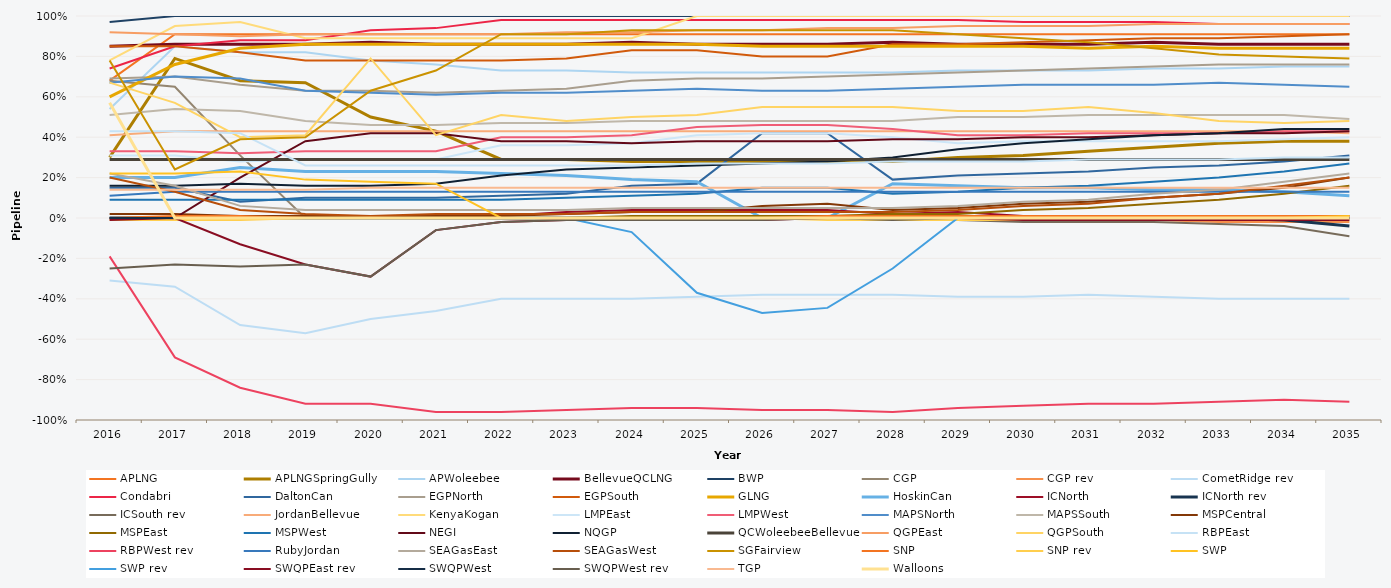
| Category | APLNG | APLNGSpringGully | APWoleebee | BellevueQCLNG | BWP | CGP | CGP rev | CometRidge rev | Condabri | DaltonCan | EGPNorth | EGPSouth | GLNG | HoskinCan | ICNorth | ICNorth rev | ICSouth rev | JordanBellevue | KenyaKogan | LMPEast | LMPWest | MAPSNorth | MAPSSouth | MSPCentral | MSPEast | MSPWest | NEGI | NQGP | QCWoleebeeBellevue | QGPEast | QGPSouth | RBPEast | RBPWest rev | RubyJordan | SEAGasEast | SEAGasWest | SGFairview | SNP | SNP rev | SWP | SWP rev | SWQPEast rev | SWQPWest | SWQPWest rev | TGP | Walloons |
|---|---|---|---|---|---|---|---|---|---|---|---|---|---|---|---|---|---|---|---|---|---|---|---|---|---|---|---|---|---|---|---|---|---|---|---|---|---|---|---|---|---|---|---|---|---|---|
| 2016.0 | 0.68 | 0.3 | 0.54 | 0.85 | 0.97 | 0.68 | 0 | -0.31 | 0.74 | 0.15 | 0.69 | 0.85 | 0.6 | 0.2 | 0 | 0 | 0 | 0.41 | 0.78 | 0.31 | 0.33 | 0.67 | 0.51 | 0.02 | 0 | 0.09 | 0 | 0.16 | 0.29 | 0.92 | 0.67 | 0.43 | -0.19 | 0.11 | 0.22 | 0.2 | 0.78 | 0 | -0.01 | 0.22 | 0 | -0.01 | 0 | -0.25 | 0.14 | 0.57 |
| 2017.0 | 0.91 | 0.79 | 0.85 | 0.86 | 1 | 0.65 | 0 | -0.34 | 0.85 | 0.15 | 0.7 | 0.85 | 0.76 | 0.2 | 0 | 0 | 0 | 0.43 | 0.95 | 0.31 | 0.33 | 0.7 | 0.54 | 0.02 | 0 | 0.09 | 0 | 0.16 | 0.29 | 0.91 | 0.57 | 0.43 | -0.69 | 0.13 | 0.16 | 0.13 | 0.24 | 0.01 | -0.01 | 0.22 | 0 | 0 | 0 | -0.23 | 0.14 | 0 |
| 2018.0 | 0.91 | 0.68 | 0.82 | 0.86 | 1 | 0.31 | 0 | -0.53 | 0.88 | 0.08 | 0.66 | 0.82 | 0.84 | 0.25 | 0 | 0 | 0 | 0.43 | 0.97 | 0.28 | 0.32 | 0.69 | 0.53 | 0.01 | 0 | 0.09 | 0.2 | 0.17 | 0.29 | 0.9 | 0.4 | 0.42 | -0.84 | 0.13 | 0.06 | 0.04 | 0.39 | 0.01 | -0.01 | 0.23 | 0 | -0.13 | 0 | -0.24 | 0.14 | 0 |
| 2019.0 | 0.91 | 0.67 | 0.82 | 0.86 | 1 | 0 | 0 | -0.57 | 0.88 | 0.1 | 0.63 | 0.78 | 0.86 | 0.23 | 0 | 0 | 0 | 0.43 | 0.89 | 0.29 | 0.33 | 0.63 | 0.48 | 0.01 | 0 | 0.09 | 0.38 | 0.16 | 0.29 | 0.91 | 0.41 | 0.26 | -0.92 | 0.13 | 0.04 | 0.02 | 0.4 | 0 | 0 | 0.19 | 0 | -0.23 | 0 | -0.23 | 0.14 | 0 |
| 2020.0 | 0.91 | 0.5 | 0.78 | 0.87 | 1 | 0 | 0 | -0.5 | 0.93 | 0.1 | 0.63 | 0.78 | 0.86 | 0.23 | 0 | 0 | 0 | 0.43 | 0.89 | 0.29 | 0.33 | 0.62 | 0.46 | 0.01 | 0 | 0.09 | 0.42 | 0.16 | 0.29 | 0.91 | 0.79 | 0.26 | -0.92 | 0.13 | 0.04 | 0.01 | 0.63 | 0 | 0 | 0.18 | 0 | -0.29 | 0 | -0.29 | 0.15 | 0 |
| 2021.0 | 0.91 | 0.43 | 0.76 | 0.86 | 1 | 0 | 0 | -0.46 | 0.94 | 0.1 | 0.62 | 0.78 | 0.86 | 0.23 | 0 | 0 | 0 | 0.43 | 0.89 | 0.29 | 0.33 | 0.61 | 0.46 | 0.01 | 0 | 0.09 | 0.42 | 0.17 | 0.29 | 0.91 | 0.41 | 0.26 | -0.96 | 0.13 | 0.04 | 0.02 | 0.73 | 0 | 0 | 0.17 | 0 | -0.06 | 0 | -0.06 | 0.15 | 0 |
| 2022.0 | 0.91 | 0.29 | 0.73 | 0.86 | 1 | 0 | 0 | -0.4 | 0.98 | 0.11 | 0.63 | 0.78 | 0.86 | 0.22 | 0.01 | 0 | 0 | 0.43 | 0.89 | 0.36 | 0.4 | 0.62 | 0.47 | 0.01 | 0 | 0.09 | 0.38 | 0.21 | 0.29 | 0.91 | 0.51 | 0.26 | -0.96 | 0.13 | 0.04 | 0.02 | 0.91 | 0 | 0 | 0 | 0 | -0.02 | 0 | -0.02 | 0.15 | 0 |
| 2023.0 | 0.91 | 0.29 | 0.73 | 0.86 | 1 | 0 | 0 | -0.4 | 0.98 | 0.12 | 0.64 | 0.79 | 0.86 | 0.21 | 0.03 | 0 | 0 | 0.43 | 0.89 | 0.36 | 0.4 | 0.62 | 0.47 | 0.02 | 0 | 0.1 | 0.38 | 0.24 | 0.29 | 0.92 | 0.48 | 0.26 | -0.95 | 0.13 | 0.04 | 0.02 | 0.91 | 0 | 0 | 0 | 0 | -0.01 | 0 | -0.01 | 0.15 | 0 |
| 2024.0 | 0.91 | 0.28 | 0.72 | 0.87 | 1 | 0 | 0 | -0.4 | 0.98 | 0.16 | 0.68 | 0.83 | 0.86 | 0.19 | 0.04 | 0 | 0 | 0.43 | 0.89 | 0.37 | 0.41 | 0.63 | 0.48 | 0.03 | 0.01 | 0.11 | 0.37 | 0.25 | 0.29 | 0.92 | 0.5 | 0.26 | -0.94 | 0.13 | 0.05 | 0.03 | 0.93 | 0 | 0 | 0 | -0.07 | -0.01 | 0 | -0.01 | 0.15 | 0 |
| 2025.0 | 0.91 | 0.28 | 0.72 | 0.86 | 1 | 0 | 0 | -0.39 | 0.98 | 0.17 | 0.69 | 0.83 | 0.86 | 0.18 | 0.04 | 0 | 0 | 0.43 | 1 | 0.41 | 0.45 | 0.64 | 0.48 | 0.03 | 0.01 | 0.12 | 0.38 | 0.26 | 0.29 | 0.93 | 0.51 | 0.27 | -0.94 | 0.13 | 0.05 | 0.03 | 0.93 | 0 | 0 | 0 | -0.37 | -0.01 | 0 | -0.01 | 0.15 | 0 |
| 2026.0 | 0.91 | 0.28 | 0.72 | 0.86 | 1 | 0 | 0 | -0.38 | 0.98 | 0.42 | 0.69 | 0.8 | 0.85 | 0 | 0.04 | 0 | 0 | 0.43 | 1 | 0.42 | 0.46 | 0.63 | 0.48 | 0.06 | 0.01 | 0.15 | 0.38 | 0.27 | 0.29 | 0.93 | 0.55 | 0.27 | -0.95 | 0.13 | 0.05 | 0.03 | 0.93 | 0 | 0 | 0 | -0.47 | -0.01 | 0 | -0.01 | 0.15 | 0 |
| 2027.0 | 0.91 | 0.28 | 0.72 | 0.86 | 1 | 0 | 0 | -0.38 | 0.98 | 0.42 | 0.7 | 0.8 | 0.85 | 0 | 0.04 | 0 | 0 | 0.43 | 1 | 0.42 | 0.46 | 0.63 | 0.48 | 0.07 | 0.01 | 0.15 | 0.38 | 0.28 | 0.29 | 0.94 | 0.55 | 0.27 | -0.95 | 0.13 | 0.05 | 0.03 | 0.93 | 0.01 | -0.01 | 0 | -0.445 | 0 | 0 | 0 | 0.15 | 0 |
| 2028.0 | 0.91 | 0.28 | 0.72 | 0.87 | 1 | 0 | 0 | -0.38 | 0.98 | 0.19 | 0.71 | 0.86 | 0.85 | 0.17 | 0.02 | 0 | -0.01 | 0.43 | 1 | 0.4 | 0.44 | 0.64 | 0.48 | 0.04 | 0.02 | 0.12 | 0.39 | 0.3 | 0.29 | 0.94 | 0.55 | 0.28 | -0.96 | 0.13 | 0.05 | 0.03 | 0.93 | 0.01 | -0.01 | 0 | -0.25 | 0 | 0 | -0.01 | 0.15 | 0 |
| 2029.0 | 0.91 | 0.3 | 0.73 | 0.86 | 1 | 0 | 0 | -0.39 | 0.98 | 0.21 | 0.72 | 0.86 | 0.85 | 0.16 | 0.03 | 0 | -0.01 | 0.43 | 1 | 0.37 | 0.41 | 0.65 | 0.5 | 0.05 | 0.02 | 0.13 | 0.39 | 0.34 | 0.29 | 0.95 | 0.53 | 0.28 | -0.94 | 0.13 | 0.06 | 0.04 | 0.91 | 0.01 | -0.01 | 0 | 0 | 0 | 0 | 0 | 0.15 | 0 |
| 2030.0 | 0.91 | 0.31 | 0.73 | 0.86 | 1 | 0 | 0 | -0.39 | 0.97 | 0.22 | 0.73 | 0.87 | 0.85 | 0.15 | 0.01 | 0 | -0.02 | 0.43 | 1 | 0.38 | 0.41 | 0.66 | 0.5 | 0.07 | 0.04 | 0.15 | 0.4 | 0.37 | 0.29 | 0.95 | 0.53 | 0.28 | -0.93 | 0.13 | 0.08 | 0.06 | 0.89 | 0.01 | -0.01 | 0 | 0 | -0.01 | 0 | 0 | 0.15 | 0 |
| 2031.0 | 0.91 | 0.33 | 0.73 | 0.86 | 1 | 0 | -0.01 | -0.38 | 0.97 | 0.23 | 0.74 | 0.88 | 0.84 | 0.15 | 0.01 | 0 | -0.02 | 0.43 | 1 | 0.38 | 0.42 | 0.66 | 0.51 | 0.08 | 0.05 | 0.16 | 0.4 | 0.39 | 0.29 | 0.95 | 0.55 | 0.29 | -0.92 | 0.13 | 0.09 | 0.07 | 0.87 | 0.01 | -0.01 | 0 | 0 | -0.01 | 0 | 0 | 0.15 | 0 |
| 2032.0 | 0.91 | 0.35 | 0.74 | 0.87 | 1 | 0 | -0.01 | -0.39 | 0.97 | 0.25 | 0.75 | 0.89 | 0.85 | 0.14 | 0.01 | 0 | -0.02 | 0.43 | 1 | 0.38 | 0.42 | 0.66 | 0.51 | 0.1 | 0.07 | 0.18 | 0.41 | 0.41 | 0.29 | 0.96 | 0.52 | 0.29 | -0.92 | 0.13 | 0.12 | 0.1 | 0.84 | 0.01 | -0.01 | 0 | 0 | -0.01 | 0 | 0 | 0.15 | 0 |
| 2033.0 | 0.91 | 0.37 | 0.74 | 0.86 | 1 | 0 | -0.02 | -0.4 | 0.96 | 0.26 | 0.76 | 0.89 | 0.84 | 0.14 | 0.01 | 0 | -0.03 | 0.43 | 1 | 0.38 | 0.42 | 0.67 | 0.51 | 0.12 | 0.09 | 0.2 | 0.42 | 0.42 | 0.29 | 0.96 | 0.48 | 0.29 | -0.91 | 0.13 | 0.14 | 0.12 | 0.81 | 0.01 | -0.01 | 0 | 0 | -0.01 | 0 | 0 | 0.15 | 0 |
| 2034.0 | 0.91 | 0.38 | 0.75 | 0.86 | 1 | 0 | -0.02 | -0.4 | 0.96 | 0.28 | 0.76 | 0.9 | 0.84 | 0.13 | 0 | -0.01 | -0.04 | 0.43 | 1 | 0.39 | 0.43 | 0.66 | 0.51 | 0.15 | 0.12 | 0.23 | 0.42 | 0.44 | 0.29 | 0.96 | 0.47 | 0.3 | -0.9 | 0.13 | 0.18 | 0.16 | 0.8 | 0.01 | -0.01 | 0 | 0 | -0.01 | 0 | 0 | 0.15 | 0 |
| 2035.0 | 0.91 | 0.38 | 0.75 | 0.86 | 1 | 0 | -0.02 | -0.4 | 0.96 | 0.31 | 0.76 | 0.91 | 0.84 | 0.11 | 0.01 | -0.04 | -0.09 | 0.42 | 1 | 0.4 | 0.43 | 0.65 | 0.49 | 0.2 | 0.16 | 0.27 | 0.43 | 0.44 | 0.29 | 0.96 | 0.48 | 0.3 | -0.91 | 0.13 | 0.22 | 0.2 | 0.79 | 0.01 | -0.01 | 0.01 | 0 | -0.01 | 0 | 0 | 0.15 | 0 |